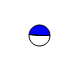
| Category | Series 0 |
|---|---|
| 0 | 16532 |
| 1 | 15530 |